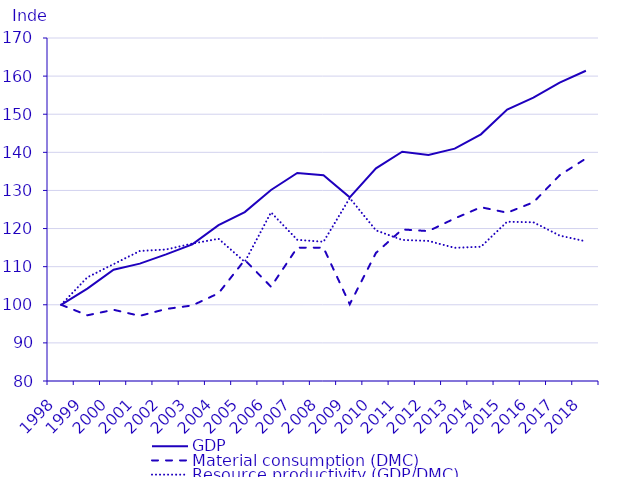
| Category | GDP | Material consumption (DMC) | Resource productivity (GDP/DMC) |
|---|---|---|---|
| 1998.0 | 100 | 100 | 100 |
| 1999.0 | 104.247 | 97.241 | 107.205 |
| 2000.0 | 109.216 | 98.687 | 110.669 |
| 2001.0 | 110.799 | 97.091 | 114.118 |
| 2002.0 | 113.233 | 98.892 | 114.502 |
| 2003.0 | 115.849 | 99.823 | 116.054 |
| 2004.0 | 120.873 | 103.025 | 117.324 |
| 2005.0 | 124.328 | 111.765 | 111.24 |
| 2006.0 | 130.126 | 104.734 | 124.243 |
| 2007.0 | 134.601 | 114.994 | 117.051 |
| 2008.0 | 133.994 | 114.987 | 116.53 |
| 2009.0 | 128.179 | 100.135 | 128.006 |
| 2010.0 | 135.809 | 113.619 | 119.529 |
| 2011.0 | 140.148 | 119.768 | 117.016 |
| 2012.0 | 139.324 | 119.331 | 116.754 |
| 2013.0 | 140.979 | 122.65 | 114.944 |
| 2014.0 | 144.726 | 125.596 | 115.231 |
| 2015.0 | 151.223 | 124.168 | 121.788 |
| 2016.0 | 154.354 | 126.883 | 121.65 |
| 2017.0 | 158.318 | 133.983 | 118.162 |
| 2018.0 | 161.405 | 138.379 | 116.64 |